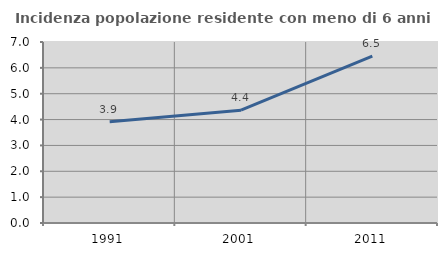
| Category | Incidenza popolazione residente con meno di 6 anni |
|---|---|
| 1991.0 | 3.917 |
| 2001.0 | 4.362 |
| 2011.0 | 6.453 |